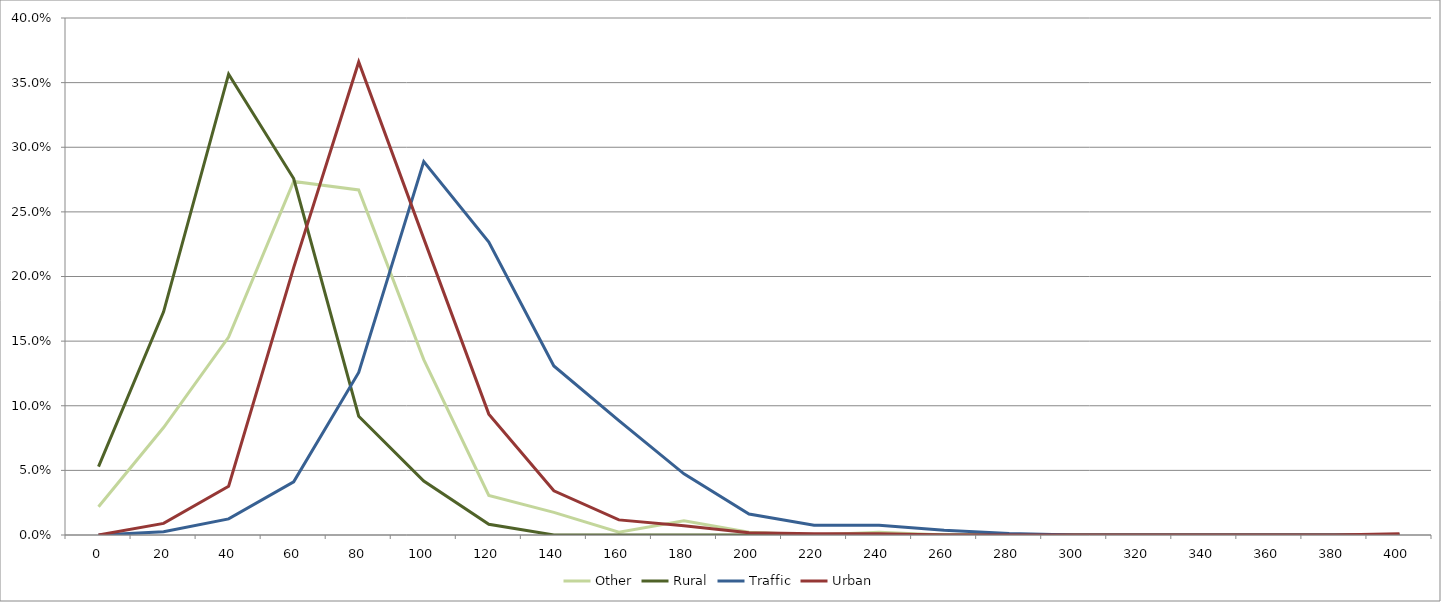
| Category | Other | Rural | Traffic | Urban |
|---|---|---|---|---|
| 0.0 | 0.022 | 0.053 | 0 | 0 |
| 20.0 | 0.083 | 0.173 | 0.002 | 0.009 |
| 40.0 | 0.153 | 0.357 | 0.012 | 0.038 |
| 60.0 | 0.274 | 0.276 | 0.041 | 0.207 |
| 80.0 | 0.267 | 0.092 | 0.126 | 0.366 |
| 100.0 | 0.136 | 0.042 | 0.289 | 0.229 |
| 120.0 | 0.031 | 0.008 | 0.227 | 0.094 |
| 140.0 | 0.018 | 0 | 0.131 | 0.034 |
| 160.0 | 0.002 | 0 | 0.088 | 0.012 |
| 180.0 | 0.011 | 0 | 0.047 | 0.007 |
| 200.0 | 0.002 | 0 | 0.016 | 0.002 |
| 220.0 | 0 | 0 | 0.007 | 0.001 |
| 240.0 | 0.002 | 0 | 0.007 | 0.001 |
| 260.0 | 0 | 0 | 0.004 | 0 |
| 280.0 | 0 | 0 | 0.001 | 0 |
| 300.0 | 0 | 0 | 0 | 0 |
| 320.0 | 0 | 0 | 0 | 0 |
| 340.0 | 0 | 0 | 0 | 0 |
| 360.0 | 0 | 0 | 0 | 0 |
| 380.0 | 0 | 0 | 0 | 0 |
| 400.0 | 0 | 0 | 0 | 0.001 |